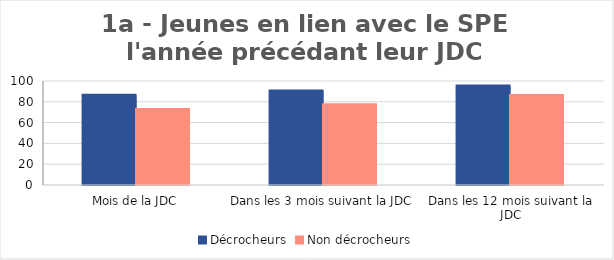
| Category | Décrocheurs | Non décrocheurs |
|---|---|---|
| Mois de la JDC | 86.275 | 72.544 |
| Dans les 3 mois suivant la JDC | 90.46 | 77.098 |
| Dans les 12 mois suivant la JDC | 95.238 | 86.136 |